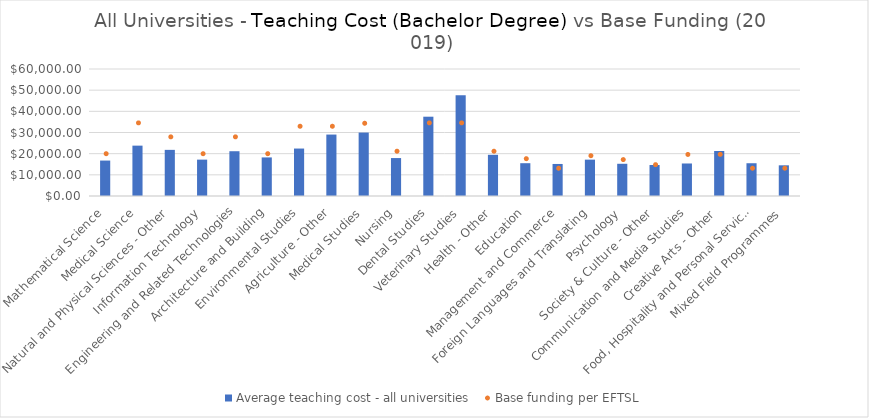
| Category | Average teaching cost - all universities  |
|---|---|
| Mathematical Science | 16739.948 |
| Medical Science | 23791.483 |
| Natural and Physical Sciences - Other | 21795.771 |
| Information Technology | 17180.712 |
| Engineering and Related Technologies | 21154.374 |
| Architecture and Building | 18224.499 |
| Environmental Studies | 22419.268 |
| Agriculture - Other | 29027.524 |
| Medical Studies | 29969.685 |
| Nursing | 17927.808 |
| Dental Studies | 37465.455 |
| Veterinary Studies | 47646.549 |
| Health - Other | 19455.503 |
| Education | 15493.57 |
| Management and Commerce | 15134.857 |
| Foreign Languages and Translating | 17175.269 |
| Psychology | 15222.04 |
| Society & Culture - Other | 14637.667 |
| Communication and Media Studies | 15360.938 |
| Creative Arts - Other | 21271.573 |
| Food, Hospitality and Personal Services | 15480.673 |
| Mixed Field Programmes | 14497.042 |